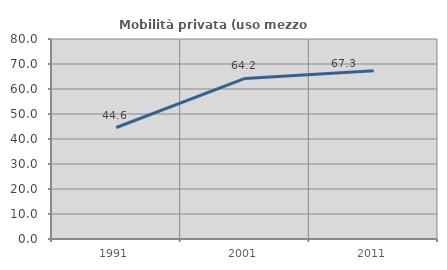
| Category | Mobilità privata (uso mezzo privato) |
|---|---|
| 1991.0 | 44.595 |
| 2001.0 | 64.24 |
| 2011.0 | 67.275 |